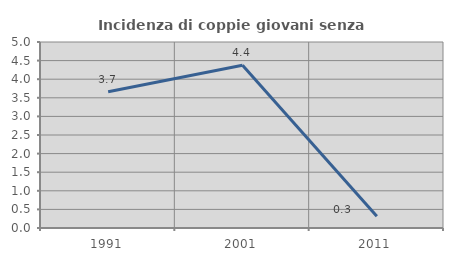
| Category | Incidenza di coppie giovani senza figli |
|---|---|
| 1991.0 | 3.663 |
| 2001.0 | 4.377 |
| 2011.0 | 0.314 |